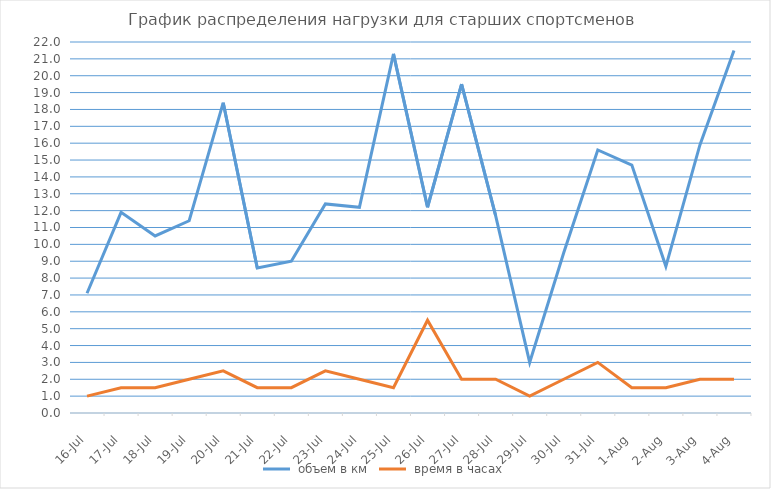
| Category |  объем в км |  время в часах |
|---|---|---|
| 2016-07-16 | 7.1 | 1 |
| 2016-07-17 | 11.9 | 1.5 |
| 2016-07-18 | 10.5 | 1.5 |
| 2016-07-19 | 11.4 | 2 |
| 2016-07-20 | 18.4 | 2.5 |
| 2016-07-21 | 8.6 | 1.5 |
| 2016-07-22 | 9 | 1.5 |
| 2016-07-23 | 12.4 | 2.5 |
| 2016-07-24 | 12.2 | 2 |
| 2016-07-25 | 21.3 | 1.5 |
| 2016-07-26 | 12.2 | 5.5 |
| 2016-07-27 | 19.5 | 2 |
| 2016-07-28 | 11.7 | 2 |
| 2016-07-29 | 3 | 1 |
| 2016-07-30 | 9.5 | 2 |
| 2016-07-31 | 15.6 | 3 |
| 2016-08-01 | 14.7 | 1.5 |
| 2016-08-02 | 8.7 | 1.5 |
| 2016-08-03 | 15.9 | 2 |
| 2016-08-04 | 21.5 | 2 |